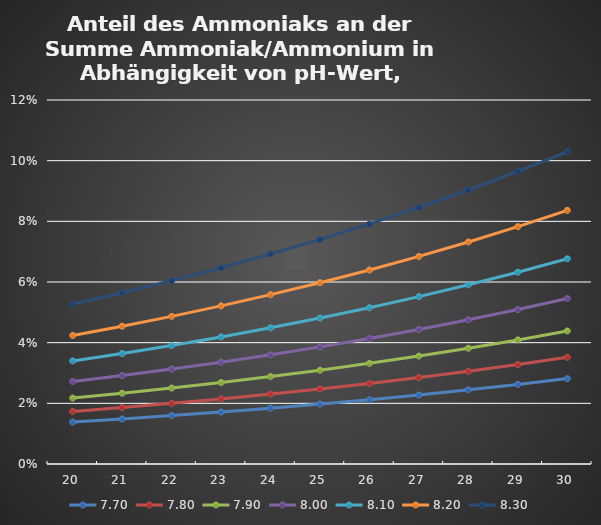
| Category | 7,70 | 7,80 | 7,90 | 8,00 | 8,10 | 8,20 | 8,30 |
|---|---|---|---|---|---|---|---|
| 20.0 | 0.014 | 0.017 | 0.022 | 0.027 | 0.034 | 0.042 | 0.053 |
| 21.0 | 0.015 | 0.019 | 0.023 | 0.029 | 0.036 | 0.045 | 0.056 |
| 22.0 | 0.016 | 0.02 | 0.025 | 0.031 | 0.039 | 0.049 | 0.06 |
| 23.0 | 0.017 | 0.021 | 0.027 | 0.034 | 0.042 | 0.052 | 0.065 |
| 24.0 | 0.018 | 0.023 | 0.029 | 0.036 | 0.045 | 0.056 | 0.069 |
| 25.0 | 0.02 | 0.025 | 0.031 | 0.039 | 0.048 | 0.06 | 0.074 |
| 26.0 | 0.021 | 0.027 | 0.033 | 0.041 | 0.052 | 0.064 | 0.079 |
| 27.0 | 0.023 | 0.028 | 0.036 | 0.044 | 0.055 | 0.068 | 0.085 |
| 28.0 | 0.024 | 0.031 | 0.038 | 0.048 | 0.059 | 0.073 | 0.09 |
| 29.0 | 0.026 | 0.033 | 0.041 | 0.051 | 0.063 | 0.078 | 0.096 |
| 30.0 | 0.028 | 0.035 | 0.044 | 0.055 | 0.068 | 0.084 | 0.103 |